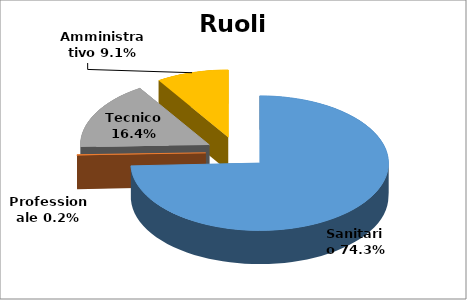
| Category | Series 0 |
|---|---|
| Sanitario | 0.743 |
| Professionale | 0.002 |
| Tecnico | 0.164 |
| Amministrativo | 0.091 |